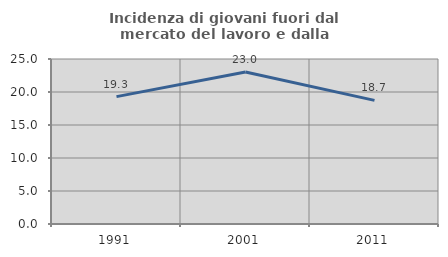
| Category | Incidenza di giovani fuori dal mercato del lavoro e dalla formazione  |
|---|---|
| 1991.0 | 19.3 |
| 2001.0 | 23.034 |
| 2011.0 | 18.726 |